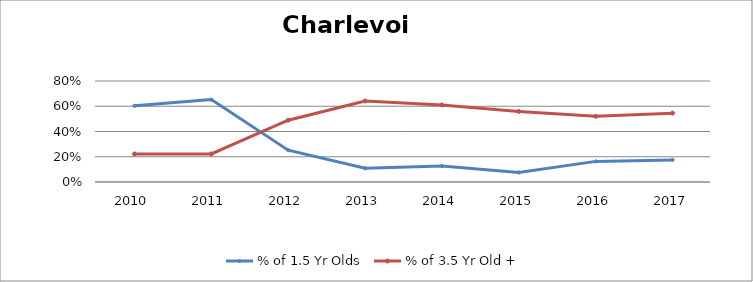
| Category | % of 1.5 Yr Olds | % of 3.5 Yr Old + |
|---|---|---|
| 2010.0 | 0.603 | 0.222 |
| 2011.0 | 0.653 | 0.222 |
| 2012.0 | 0.252 | 0.49 |
| 2013.0 | 0.109 | 0.641 |
| 2014.0 | 0.126 | 0.611 |
| 2015.0 | 0.075 | 0.559 |
| 2016.0 | 0.163 | 0.52 |
| 2017.0 | 0.175 | 0.545 |